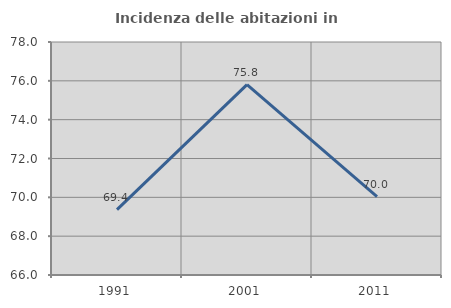
| Category | Incidenza delle abitazioni in proprietà  |
|---|---|
| 1991.0 | 69.369 |
| 2001.0 | 75.806 |
| 2011.0 | 70.039 |